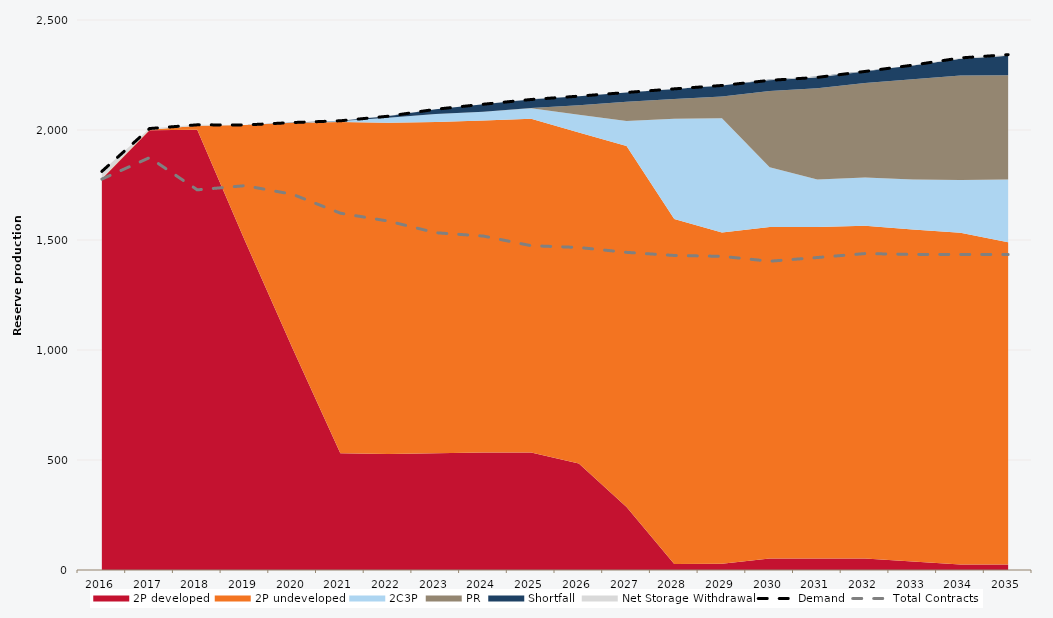
| Category | Demand | Total Contracts |
|---|---|---|
| 0 | 1811.89 | 1776.781 |
| 1 | 2006.629 | 1874.371 |
| 2 | 2023.523 | 1727.997 |
| 3 | 2022.764 | 1746.967 |
| 4 | 2033.856 | 1707.643 |
| 5 | 2041.909 | 1621.977 |
| 6 | 2062.588 | 1586.126 |
| 7 | 2094.316 | 1533.126 |
| 8 | 2117.157 | 1517.777 |
| 9 | 2138.662 | 1474.136 |
| 10 | 2153.848 | 1466.013 |
| 11 | 2170.616 | 1443.817 |
| 12 | 2186.991 | 1429.645 |
| 13 | 2202.392 | 1425.788 |
| 14 | 2225.654 | 1403.548 |
| 15 | 2239.119 | 1420.349 |
| 16 | 2266.091 | 1438.314 |
| 17 | 2294.844 | 1434.467 |
| 18 | 2327.607 | 1434.453 |
| 19 | 2342.377 | 1434.032 |